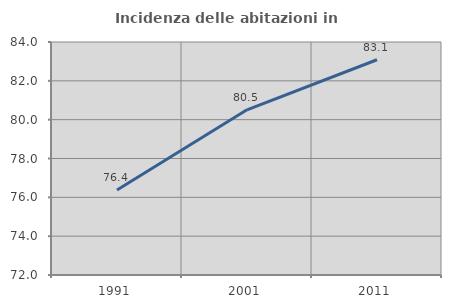
| Category | Incidenza delle abitazioni in proprietà  |
|---|---|
| 1991.0 | 76.382 |
| 2001.0 | 80.507 |
| 2011.0 | 83.085 |